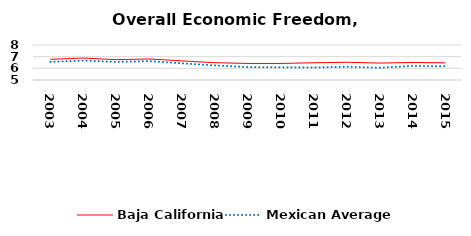
| Category | Baja California | Mexican Average  |
|---|---|---|
| 2003.0 | 6.774 | 6.552 |
| 2004.0 | 6.88 | 6.668 |
| 2005.0 | 6.742 | 6.546 |
| 2006.0 | 6.804 | 6.619 |
| 2007.0 | 6.636 | 6.428 |
| 2008.0 | 6.481 | 6.248 |
| 2009.0 | 6.419 | 6.106 |
| 2010.0 | 6.419 | 6.086 |
| 2011.0 | 6.476 | 6.074 |
| 2012.0 | 6.521 | 6.134 |
| 2013.0 | 6.449 | 6.054 |
| 2014.0 | 6.504 | 6.2 |
| 2015.0 | 6.468 | 6.174 |